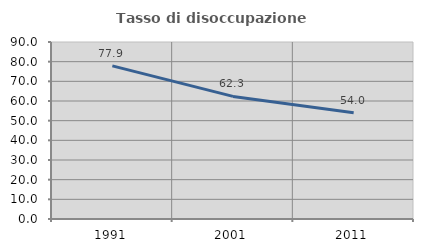
| Category | Tasso di disoccupazione giovanile  |
|---|---|
| 1991.0 | 77.86 |
| 2001.0 | 62.329 |
| 2011.0 | 54.032 |